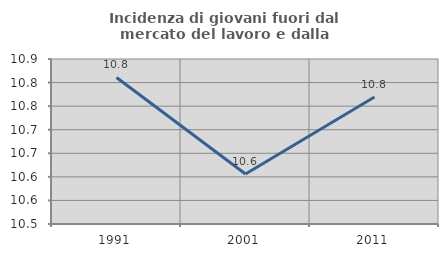
| Category | Incidenza di giovani fuori dal mercato del lavoro e dalla formazione  |
|---|---|
| 1991.0 | 10.811 |
| 2001.0 | 10.606 |
| 2011.0 | 10.769 |